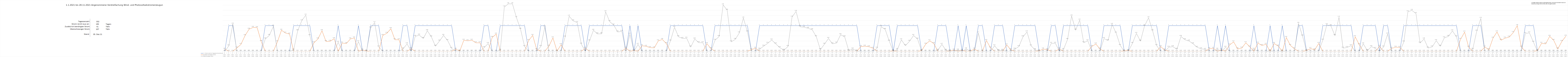
| Category | 1 = Strom reicht im Tagesdurchschnitt aus | Zusätzlich benötigter Strom | Überschüssiger Strom |
|---|---|---|---|
| 0 | 0 | 0.08 | 0 |
| 1 | 1 | 0 | 0.21 |
| 2 | 1 | 0 | 1.06 |
| 3 | 0 | 0.13 | 0 |
| 4 | 0 | 0.27 | 0 |
| 5 | 0 | 0.61 | 0 |
| 6 | 0 | 0.86 | 0 |
| 7 | 0 | 0.93 | 0 |
| 8 | 0 | 0.92 | 0 |
| 9 | 0 | 0.38 | 0 |
| 10 | 1 | 0 | 0.48 |
| 11 | 1 | 0 | 0.62 |
| 12 | 1 | 0 | 0.97 |
| 13 | 0 | 0.37 | 0 |
| 14 | 0 | 0.82 | 0 |
| 15 | 0 | 0.71 | 0 |
| 16 | 0 | 0.67 | 0 |
| 17 | 1 | 0 | 0.05 |
| 18 | 1 | 0 | 0.8 |
| 19 | 1 | 0 | 1.19 |
| 20 | 1 | 0 | 1.41 |
| 21 | 1 | 0 | 0.61 |
| 22 | 0 | 0.33 | 0 |
| 23 | 0 | 0.48 | 0 |
| 24 | 0 | 0.8 | 0 |
| 25 | 0 | 0.38 | 0 |
| 26 | 0 | 0.39 | 0 |
| 27 | 0 | 0.49 | 0 |
| 28 | 1 | 0 | 0.35 |
| 29 | 0 | 0.32 | 0 |
| 30 | 0 | 0.3 | 0 |
| 31 | 0 | 0.48 | 0 |
| 32 | 0 | 0.52 | 0 |
| 33 | 1 | 0 | 0.37 |
| 34 | 0 | 0.05 | 0 |
| 35 | 0 | 0.01 | 0 |
| 36 | 1 | 0 | 0.91 |
| 37 | 1 | 0 | 1.12 |
| 38 | 1 | 0 | 0.17 |
| 39 | 0 | 0.62 | 0 |
| 40 | 0 | 0.7 | 0 |
| 41 | 0 | 0.88 | 0 |
| 42 | 0 | 0.45 | 0 |
| 43 | 0 | 0.45 | 0 |
| 44 | 1 | 0 | 0.09 |
| 45 | 1 | 0 | 0.29 |
| 46 | 0 | 0.1 | 0 |
| 47 | 1 | 0 | 0.58 |
| 48 | 1 | 0 | 0.63 |
| 49 | 1 | 0 | 0.5 |
| 50 | 1 | 0 | 0.8 |
| 51 | 1 | 0 | 0.56 |
| 52 | 1 | 0 | 0.2 |
| 53 | 1 | 0 | 0.4 |
| 54 | 1 | 0 | 0.62 |
| 55 | 1 | 0 | 0.42 |
| 56 | 1 | 0 | 0.11 |
| 57 | 0 | 0.08 | 0 |
| 58 | 0 | 0.01 | 0 |
| 59 | 0 | 0.43 | 0 |
| 60 | 0 | 0.41 | 0 |
| 61 | 0 | 0.43 | 0 |
| 62 | 0 | 0.33 | 0 |
| 63 | 0 | 0.33 | 0 |
| 64 | 1 | 0 | 0.14 |
| 65 | 1 | 0 | 0.3 |
| 66 | 0 | 0.54 | 0 |
| 67 | 0 | 0.67 | 0 |
| 68 | 1 | 0 | 0.04 |
| 69 | 1 | 0 | 1.73 |
| 70 | 1 | 0 | 1.85 |
| 71 | 1 | 0 | 1.85 |
| 72 | 1 | 0 | 1.31 |
| 73 | 1 | 0 | 0.861 |
| 74 | 1 | 0 | 0.185 |
| 75 | 0 | 0.42 | 0 |
| 76 | 0 | 0.619 | 0 |
| 77 | 0 | 0.064 | 0 |
| 78 | 1 | 0 | 0.187 |
| 79 | 1 | 0 | 0.946 |
| 80 | 0 | 0.198 | 0 |
| 81 | 0 | 0.523 | 0 |
| 82 | 0 | 0.007 | 0 |
| 83 | 0 | 0.257 | 0 |
| 84 | 1 | 0 | 0.555 |
| 85 | 1 | 0 | 1.369 |
| 86 | 1 | 0 | 1.186 |
| 87 | 1 | 0 | 1.12 |
| 88 | 1 | 0 | 0.278 |
| 89 | 0 | 0.117 | 0 |
| 90 | 1 | 0 | 0.403 |
| 91 | 1 | 0 | 0.819 |
| 92 | 1 | 0 | 0.676 |
| 93 | 1 | 0 | 0.681 |
| 94 | 1 | 0 | 1.541 |
| 95 | 1 | 0 | 1.158 |
| 96 | 1 | 0 | 1.022 |
| 97 | 1 | 0 | 0.752 |
| 98 | 1 | 0 | 0.776 |
| 99 | 0 | 0.123 | 0 |
| 100 | 1 | 0 | 0.665 |
| 101 | 0 | 0.034 | 0 |
| 102 | 1 | 0 | 0.269 |
| 103 | 0 | 0.218 | 0 |
| 104 | 0 | 0.193 | 0 |
| 105 | 0 | 0.144 | 0 |
| 106 | 0 | 0.133 | 0 |
| 107 | 0 | 0.407 | 0 |
| 108 | 0 | 0.46 | 0 |
| 109 | 0 | 0.3 | 0 |
| 110 | 1 | 0 | 0.402 |
| 111 | 1 | 0 | 0.934 |
| 112 | 1 | 0 | 0.567 |
| 113 | 1 | 0 | 0.498 |
| 114 | 1 | 0 | 0.509 |
| 115 | 1 | 0 | 0.167 |
| 116 | 1 | 0 | 0.478 |
| 117 | 1 | 0 | 0.336 |
| 118 | 1 | 0 | 0.331 |
| 119 | 0 | 0.296 | 0 |
| 120 | 0 | 0.103 | 0 |
| 121 | 1 | 0 | 0.432 |
| 122 | 1 | 0 | 0.575 |
| 123 | 1 | 0 | 1.808 |
| 124 | 1 | 0 | 1.602 |
| 125 | 1 | 0 | 0.369 |
| 126 | 1 | 0 | 0.463 |
| 127 | 1 | 0 | 0.716 |
| 128 | 1 | 0 | 1.296 |
| 129 | 1 | 0 | 0.755 |
| 130 | 0 | 0.067 | 0 |
| 131 | 0 | 0.117 | 0 |
| 132 | 1 | 0 | 0.081 |
| 133 | 1 | 0 | 0.2 |
| 134 | 1 | 0 | 0.31 |
| 135 | 1 | 0 | 0.44 |
| 136 | 1 | 0 | 0.289 |
| 137 | 1 | 0 | 0.142 |
| 138 | 1 | 0 | 0.041 |
| 139 | 1 | 0 | 0.186 |
| 140 | 1 | 0 | 1.332 |
| 141 | 1 | 0 | 1.555 |
| 142 | 1 | 0 | 0.955 |
| 143 | 1 | 0 | 0.938 |
| 144 | 1 | 0 | 0.894 |
| 145 | 1 | 0 | 0.838 |
| 146 | 1 | 0 | 0.567 |
| 147 | 1 | 0 | 0.064 |
| 148 | 1 | 0 | 0.276 |
| 149 | 1 | 0 | 0.498 |
| 150 | 1 | 0 | 0.292 |
| 151 | 1 | 0 | 0.321 |
| 152 | 1 | 0 | 0.646 |
| 153 | 1 | 0 | 0.563 |
| 154 | 1 | 0 | 0.026 |
| 155 | 1 | 0 | 0.087 |
| 156 | 1 | 0 | 0.009 |
| 157 | 0 | 0.184 | 0 |
| 158 | 0 | 0.199 | 0 |
| 159 | 0 | 0.177 | 0 |
| 160 | 0 | 0.116 | 0 |
| 161 | 1 | 0 | 0.12 |
| 162 | 1 | 0 | 0.959 |
| 163 | 1 | 0 | 0.851 |
| 164 | 1 | 0 | 0.397 |
| 165 | 0 | 0.017 | 0 |
| 166 | 1 | 0 | 0.069 |
| 167 | 1 | 0 | 0.445 |
| 168 | 1 | 0 | 0.221 |
| 169 | 1 | 0 | 0.389 |
| 170 | 1 | 0 | 0.615 |
| 171 | 1 | 0 | 0.476 |
| 172 | 0 | 0.027 | 0 |
| 173 | 0 | 0.28 | 0 |
| 174 | 0 | 0.406 | 0 |
| 175 | 0 | 0.3 | 0 |
| 176 | 1 | 0 | 0.042 |
| 177 | 1 | 0 | 0.271 |
| 178 | 1 | 0 | 0.038 |
| 179 | 0 | 0.014 | 0 |
| 180 | 0 | 0.049 | 0 |
| 181 | 1 | 0 | 0.046 |
| 182 | 0 | 0.038 | 0 |
| 183 | 1 | 0 | 0.09 |
| 184 | 0 | 0.005 | 0 |
| 185 | 0 | 0.084 | 0 |
| 186 | 1 | 0 | 0.711 |
| 187 | 1 | 0 | 0.006 |
| 188 | 0 | 0.419 | 0 |
| 189 | 0 | 0.129 | 0 |
| 190 | 1 | 0 | 0.215 |
| 191 | 1 | 0 | 0.026 |
| 192 | 1 | 0 | 0.038 |
| 193 | 0 | 0.249 | 0 |
| 194 | 0 | 0.057 | 0 |
| 195 | 1 | 0 | 0.084 |
| 196 | 1 | 0 | 0.185 |
| 197 | 1 | 0 | 0.563 |
| 198 | 1 | 0 | 0.753 |
| 199 | 1 | 0 | 0.212 |
| 200 | 1 | 0 | 0.058 |
| 201 | 0 | 0.018 | 0 |
| 202 | 0 | 0.087 | 0 |
| 203 | 0 | 0.063 | 0 |
| 204 | 1 | 0 | 0.307 |
| 205 | 1 | 0 | 0.312 |
| 206 | 0 | 0.092 | 0 |
| 207 | 1 | 0 | 0.071 |
| 208 | 1 | 0 | 0.458 |
| 209 | 1 | 0 | 1.377 |
| 210 | 1 | 0 | 0.826 |
| 211 | 1 | 0 | 1.216 |
| 212 | 1 | 0 | 0.333 |
| 213 | 1 | 0 | 0.411 |
| 214 | 0 | 0.189 | 0 |
| 215 | 0 | 0.284 | 0 |
| 216 | 0 | 0.088 | 0 |
| 217 | 1 | 0 | 0.496 |
| 218 | 1 | 0 | 0.417 |
| 219 | 1 | 0 | 1.046 |
| 220 | 1 | 0 | 0.708 |
| 221 | 1 | 0 | 0.229 |
| 222 | 0 | 0.015 | 0 |
| 223 | 0 | 0.029 | 0 |
| 224 | 1 | 0 | 0.301 |
| 225 | 1 | 0 | 0.696 |
| 226 | 1 | 0 | 0.397 |
| 227 | 1 | 0 | 0.987 |
| 228 | 1 | 0 | 1.305 |
| 229 | 1 | 0 | 0.797 |
| 230 | 1 | 0 | 0.223 |
| 231 | 0 | 0.18 | 0 |
| 232 | 0 | 0.049 | 0 |
| 233 | 1 | 0 | 0.158 |
| 234 | 1 | 0 | 0.178 |
| 235 | 1 | 0 | 0.078 |
| 236 | 1 | 0 | 0.577 |
| 237 | 1 | 0 | 0.449 |
| 238 | 1 | 0 | 0.398 |
| 239 | 1 | 0 | 0.292 |
| 240 | 1 | 0 | 0.153 |
| 241 | 1 | 0 | 0.097 |
| 242 | 1 | 0 | 0.074 |
| 243 | 0 | 0.103 | 0 |
| 244 | 0 | 0.112 | 0 |
| 245 | 1 | 0 | 0.078 |
| 246 | 0 | 0.056 | 0 |
| 247 | 1 | 0 | 0.156 |
| 248 | 0 | 0.249 | 0 |
| 249 | 0 | 0.367 | 0 |
| 250 | 0 | 0.092 | 0 |
| 251 | 0 | 0.123 | 0 |
| 252 | 0 | 0.331 | 0 |
| 253 | 0 | 0.17 | 0 |
| 254 | 1 | 0 | 0.078 |
| 255 | 0 | 0.317 | 0 |
| 256 | 0 | 0.226 | 0 |
| 257 | 0 | 0.274 | 0 |
| 258 | 1 | 0 | 0.02 |
| 259 | 0 | 0.301 | 0 |
| 260 | 0 | 0.203 | 0 |
| 261 | 1 | 0 | 0.011 |
| 262 | 0 | 0.537 | 0 |
| 263 | 0 | 0.23 | 0 |
| 264 | 0 | 0.096 | 0 |
| 265 | 1 | 0 | 1.087 |
| 266 | 1 | 0 | 0.594 |
| 267 | 0 | 0.029 | 0 |
| 268 | 0 | 0.108 | 0 |
| 269 | 0 | 0.055 | 0 |
| 270 | 0 | 0.304 | 0 |
| 271 | 1 | 0 | 0.433 |
| 272 | 1 | 0 | 1.035 |
| 273 | 1 | 0 | 0.991 |
| 274 | 1 | 0 | 0.612 |
| 275 | 1 | 0 | 1.327 |
| 276 | 1 | 0 | 0.123 |
| 277 | 1 | 0 | 0.147 |
| 278 | 1 | 0 | 0.223 |
| 279 | 0 | 0.566 | 0 |
| 280 | 0 | 0.256 | 0 |
| 281 | 1 | 0 | 0.288 |
| 282 | 1 | 0 | 0.028 |
| 283 | 1 | 0 | 0.181 |
| 284 | 1 | 0 | 0.109 |
| 285 | 0 | 0.196 | 0 |
| 286 | 1 | 0 | 0.167 |
| 287 | 1 | 0 | 0.672 |
| 288 | 0 | 0.113 | 0 |
| 289 | 0 | 0.159 | 0 |
| 290 | 0 | 0.153 | 0 |
| 291 | 1 | 0 | 0.362 |
| 292 | 1 | 0 | 1.54 |
| 293 | 1 | 0 | 1.594 |
| 294 | 1 | 0 | 1.472 |
| 295 | 1 | 0 | 0.321 |
| 296 | 1 | 0 | 0.479 |
| 297 | 1 | 0 | 0.125 |
| 298 | 1 | 0 | 0.171 |
| 299 | 1 | 0 | 0.416 |
| 300 | 1 | 0 | 0.197 |
| 301 | 1 | 0 | 0.525 |
| 302 | 1 | 0 | 0.579 |
| 303 | 1 | 0 | 0.794 |
| 304 | 1 | 0 | 0.562 |
| 305 | 0 | 0.466 | 0 |
| 306 | 0 | 0.747 | 0 |
| 307 | 0 | 0.162 | 0 |
| 308 | 1 | 0 | 0.076 |
| 309 | 1 | 0 | 0.786 |
| 310 | 1 | 0 | 1.284 |
| 311 | 0 | 0.166 | 0 |
| 312 | 0 | 0.062 | 0 |
| 313 | 0 | 0.512 | 0 |
| 314 | 0 | 0.754 | 0 |
| 315 | 0 | 0.432 | 0 |
| 316 | 0 | 0.512 | 0 |
| 317 | 0 | 0.552 | 0 |
| 318 | 0 | 0.728 | 0 |
| 319 | 0 | 1.001 | 0 |
| 320 | 0 | 0.163 | 0 |
| 321 | 1 | 0 | 0.695 |
| 322 | 1 | 0 | 0.717 |
| 323 | 1 | 0 | 0.353 |
| 324 | 0 | 0.028 | 0 |
| 325 | 0 | 0.312 | 0 |
| 326 | 0 | 0.288 | 0 |
| 327 | 0 | 0.583 | 0 |
| 328 | 0 | 0.426 | 0 |
| 329 | 0 | 0.09 | 0 |
| 330 | 0 | 0.386 | 0 |
| 331 | 0 | 0.589 | 0 |